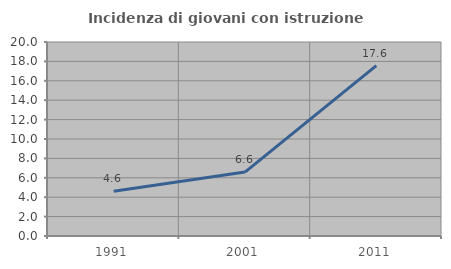
| Category | Incidenza di giovani con istruzione universitaria |
|---|---|
| 1991.0 | 4.62 |
| 2001.0 | 6.591 |
| 2011.0 | 17.56 |